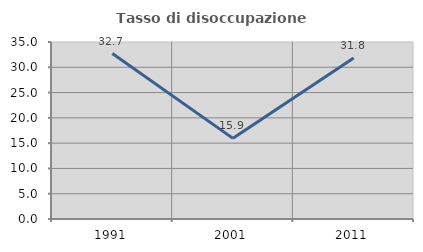
| Category | Tasso di disoccupazione giovanile  |
|---|---|
| 1991.0 | 32.717 |
| 2001.0 | 15.945 |
| 2011.0 | 31.818 |